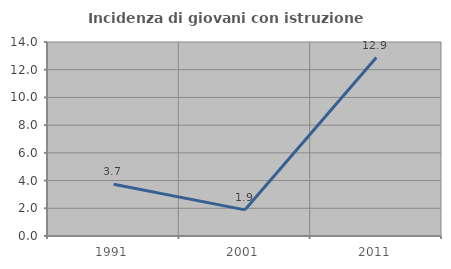
| Category | Incidenza di giovani con istruzione universitaria |
|---|---|
| 1991.0 | 3.731 |
| 2001.0 | 1.887 |
| 2011.0 | 12.879 |